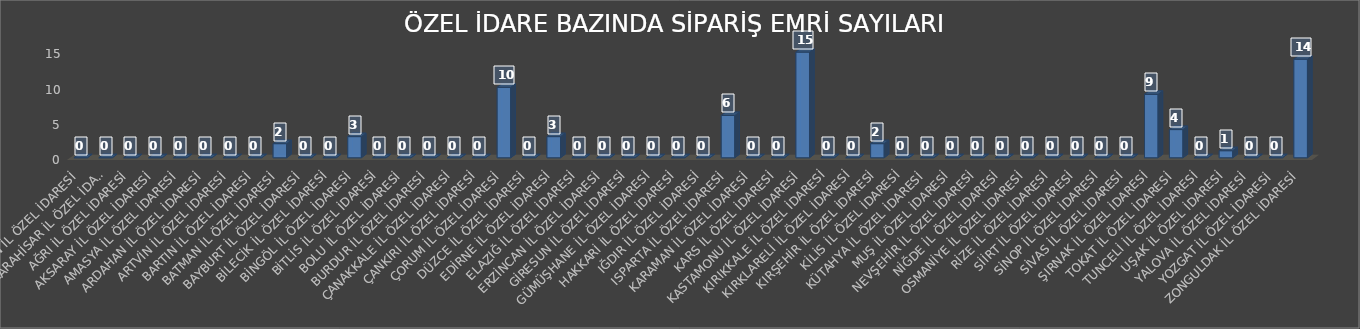
| Category | Series 0 |
|---|---|
| ADIYAMAN İL ÖZEL İDARESİ | 0 |
| AFYONKARAHİSAR İL ÖZEL İDARESİ | 0 |
| AĞRI İL ÖZEL İDARESİ | 0 |
| AKSARAY İL ÖZEL İDARESİ | 0 |
| AMASYA İL ÖZEL İDARESİ | 0 |
| ARDAHAN İL ÖZEL İDARESİ | 0 |
| ARTVİN İL ÖZEL İDARESİ | 0 |
| BARTIN İL ÖZEL İDARESİ | 0 |
| BATMAN İL ÖZEL İDARESİ | 2 |
| BAYBURT İL ÖZEL İDARESİ | 0 |
| BİLECİK İL ÖZEL İDARESİ | 0 |
| BİNGÖL İL ÖZEL İDARESİ | 3 |
| BİTLİS İL ÖZEL İDARESİ | 0 |
| BOLU İL ÖZEL İDARESİ | 0 |
| BURDUR İL ÖZEL İDARESİ | 0 |
| ÇANAKKALE İL ÖZEL İDARESİ | 0 |
| ÇANKIRI İL ÖZEL İDARESİ | 0 |
| ÇORUM İL ÖZEL İDARESİ | 10 |
| DÜZCE İL ÖZEL İDARESİ | 0 |
| EDİRNE İL ÖZEL İDARESİ | 3 |
| ELAZIĞ İL ÖZEL İDARESİ | 0 |
| ERZİNCAN İL ÖZEL İDARESİ | 0 |
| GİRESUN İL ÖZEL İDARESİ | 0 |
| GÜMÜŞHANE İL ÖZEL İDARESİ | 0 |
| HAKKARİ İL ÖZEL İDARESİ | 0 |
| IĞDIR İL ÖZEL İDARESİ | 0 |
| ISPARTA İL ÖZEL İDARESİ | 6 |
| KARAMAN İL ÖZEL İDARESİ | 0 |
| KARS İL ÖZEL İDARESİ | 0 |
| KASTAMONU İL ÖZEL İDARESİ | 15 |
| KIRIKKALE İL ÖZEL İDARESİ | 0 |
| KIRKLARELİ İL ÖZEL İDARESİ | 0 |
| KIRŞEHİR İL ÖZEL İDARESİ | 2 |
| KİLİS İL ÖZEL İDARESİ | 0 |
| KÜTAHYA İL ÖZEL İDARESİ | 0 |
| MUŞ İL ÖZEL İDARESİ | 0 |
| NEVŞEHİR İL ÖZEL İDARESİ | 0 |
| NİĞDE İL ÖZEL İDARESİ | 0 |
| OSMANİYE İL ÖZEL İDARESİ | 0 |
| RİZE İL ÖZEL İDARESİ | 0 |
| SİİRT İL ÖZEL İDARESİ | 0 |
| SİNOP İL ÖZEL İDARESİ | 0 |
| SİVAS İL ÖZEL İDARESİ | 0 |
| ŞIRNAK İL ÖZEL İDARESİ | 9 |
| TOKAT İL ÖZEL İDARESİ | 4 |
| TUNCELİ İL ÖZEL İDARESİ | 0 |
| UŞAK İL ÖZEL İDARESİ | 1 |
| YALOVA İL ÖZEL İDARESİ | 0 |
| YOZGAT İL ÖZEL İDARESİ | 0 |
| ZONGULDAK İL ÖZEL İDARESİ | 14 |